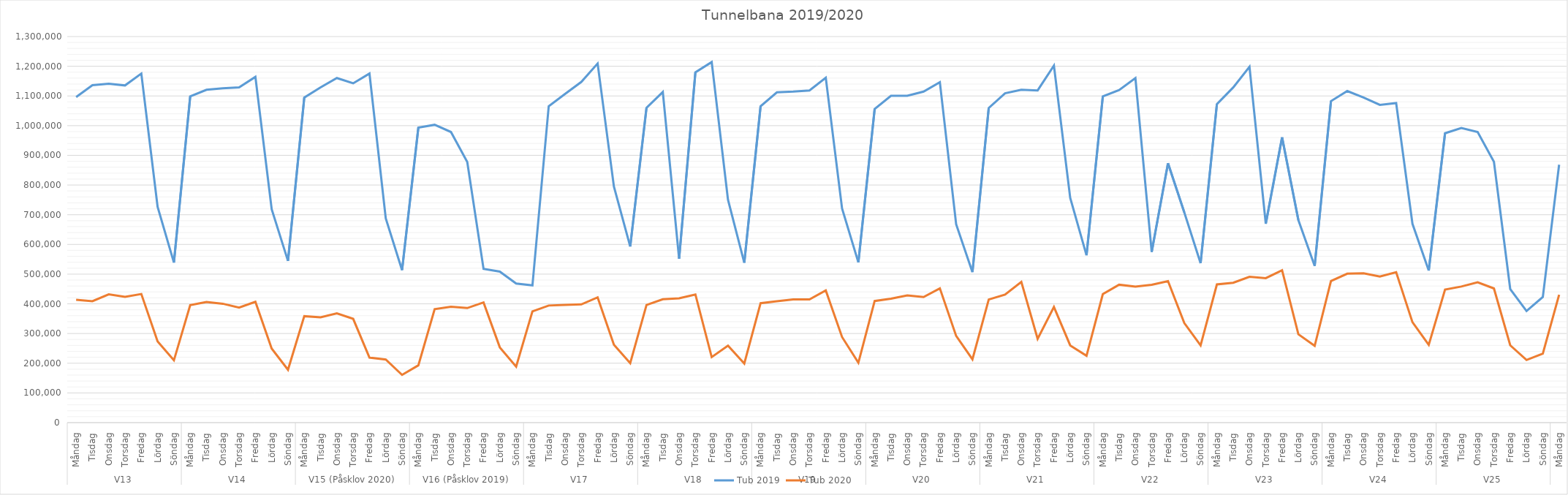
| Category | Tub 2019 | Tub 2020 |
|---|---|---|
| 0 | 1096436 | 413553 |
| 1 | 1136481 | 408845 |
| 2 | 1141469 | 432117 |
| 3 | 1135454 | 423431 |
| 4 | 1175302 | 433007 |
| 5 | 726525 | 273121 |
| 6 | 538926 | 209737 |
| 7 | 1098605 | 395422 |
| 8 | 1120649 | 406364 |
| 9 | 1125797 | 400335 |
| 10 | 1129115 | 387476 |
| 11 | 1164248 | 406893 |
| 12 | 718333 | 249473 |
| 13 | 544421 | 177865 |
| 14 | 1094742 | 358471 |
| 15 | 1129091 | 354352 |
| 16 | 1160264 | 367823 |
| 17 | 1142550 | 349484 |
| 18 | 1175399 | 218878 |
| 19 | 687842 | 212314 |
| 20 | 513473 | 160688 |
| 21 | 993406 | 192934 |
| 22 | 1002912 | 381931 |
| 23 | 978614 | 390379 |
| 24 | 877535 | 385717 |
| 25 | 517737 | 404640 |
| 26 | 508580 | 253324 |
| 27 | 468532 | 188708 |
| 28 | 462087 | 374768 |
| 29 | 1065599 | 394264 |
| 30 | 1106698 | 396651 |
| 31 | 1147208 | 397992 |
| 32 | 1209199 | 421740 |
| 33 | 794839 | 262438 |
| 34 | 593094 | 200132 |
| 35 | 1060081 | 396239 |
| 36 | 1113218 | 415310 |
| 37 | 551624 | 418609 |
| 38 | 1179411 | 431543 |
| 39 | 1214103 | 220677 |
| 40 | 750650 | 259316 |
| 41 | 538535 | 198835 |
| 42 | 1065465 | 402209 |
| 43 | 1112162 | 408836 |
| 44 | 1114510 | 415079 |
| 45 | 1118584 | 414732 |
| 46 | 1161420 | 445156 |
| 47 | 720918 | 288173 |
| 48 | 539351 | 201808 |
| 49 | 1056281 | 409428 |
| 50 | 1100626 | 417237 |
| 51 | 1100823 | 428243 |
| 52 | 1114537 | 422985 |
| 53 | 1146430 | 452130 |
| 54 | 667935 | 291967 |
| 55 | 506653 | 213147 |
| 56 | 1059516 | 414489 |
| 57 | 1109033 | 431164 |
| 58 | 1120756 | 473853 |
| 59 | 1118688 | 282334 |
| 60 | 1202169 | 389473 |
| 61 | 756460 | 259960 |
| 62 | 563696 | 225200 |
| 63 | 1098410 | 432559 |
| 64 | 1119797 | 464311 |
| 65 | 1160203 | 458050 |
| 66 | 574824 | 464263 |
| 67 | 873385 | 476287 |
| 68 | 708052 | 335290 |
| 69 | 536915 | 259937 |
| 70 | 1072609 | 465346 |
| 71 | 1128448 | 471011 |
| 72 | 1197968 | 491051 |
| 73 | 669494 | 486394 |
| 74 | 960576 | 513047 |
| 75 | 681915 | 297592 |
| 76 | 527662 | 258296 |
| 77 | 1082523 | 476865 |
| 78 | 1116498 | 501407 |
| 79 | 1094778 | 502677 |
| 80 | 1069947 | 491780 |
| 81 | 1075928 | 506613 |
| 82 | 669556 | 338219 |
| 83 | 512205 | 262036 |
| 84 | 974376 | 447775 |
| 85 | 992010 | 458288 |
| 86 | 978728 | 472360 |
| 87 | 878223 | 451804 |
| 88 | 449802 | 260326 |
| 89 | 375830 | 210936 |
| 90 | 423079 | 232562 |
| 91 | 868631 | 430489 |